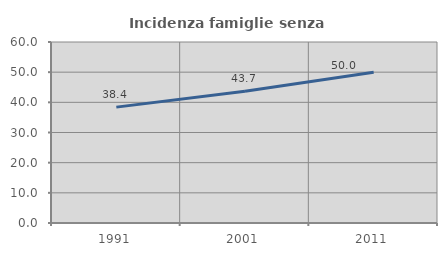
| Category | Incidenza famiglie senza nuclei |
|---|---|
| 1991.0 | 38.412 |
| 2001.0 | 43.696 |
| 2011.0 | 50 |